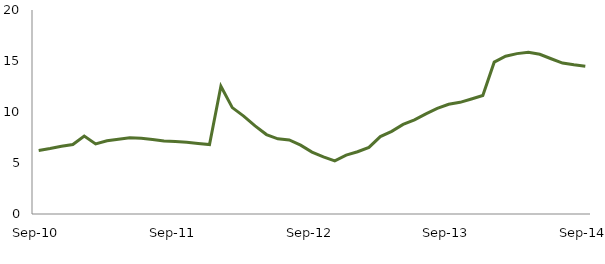
| Category | Series 0 |
|---|---|
| Sep-10 | 6.231 |
|  | 6.424 |
|  | 6.645 |
|  | 6.81 |
|  | 7.648 |
|  | 6.876 |
|  | 7.18 |
|  | 7.339 |
|  | 7.477 |
|  | 7.434 |
|  | 7.306 |
|  | 7.15 |
| Sep-11 | 7.099 |
|  | 7.034 |
|  | 6.917 |
|  | 6.811 |
|  | 12.531 |
|  | 10.433 |
|  | 9.6 |
|  | 8.643 |
|  | 7.789 |
|  | 7.371 |
|  | 7.266 |
|  | 6.753 |
| Sep-12 | 6.075 |
|  | 5.6 |
|  | 5.212 |
|  | 5.768 |
|  | 6.103 |
|  | 6.533 |
|  | 7.592 |
|  | 8.106 |
|  | 8.783 |
|  | 9.237 |
|  | 9.823 |
|  | 10.349 |
| Sep-13 | 10.753 |
|  | 10.947 |
|  | 11.281 |
|  | 11.624 |
|  | 14.885 |
|  | 15.473 |
|  | 15.725 |
|  | 15.855 |
|  | 15.657 |
|  | 15.222 |
|  | 14.798 |
|  | 14.629 |
| Sep-14 | 14.492 |